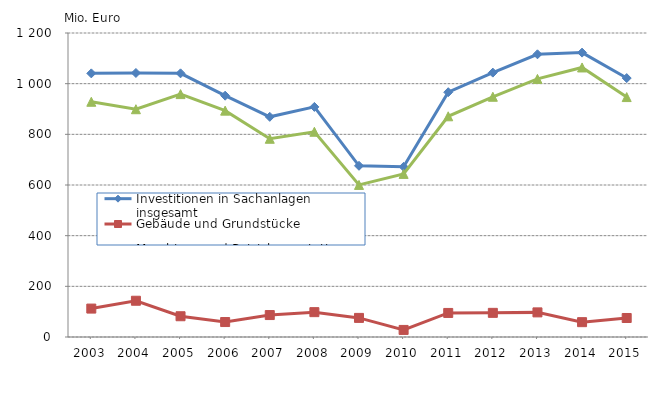
| Category | Investitionen in Sachanlagen insgesamt | Gebäude und Grundstücke | Maschinen und Betriebsausstattung |
|---|---|---|---|
| 2003.0 | 1040.673 | 112.131 | 928.542 |
| 2004.0 | 1042.199 | 143.092 | 899.107 |
| 2005.0 | 1040.771 | 81.943 | 958.828 |
| 2006.0 | 952.585 | 59.05 | 893.535 |
| 2007.0 | 869.086 | 86.618 | 782.467 |
| 2008.0 | 908.294 | 98.112 | 810.182 |
| 2009.0 | 675.811 | 75.418 | 600.393 |
| 2010.0 | 671.734 | 27.895 | 643.839 |
| 2011.0 | 966.215 | 94.98 | 871.235 |
| 2012.0 | 1043.637 | 95.334 | 948.303 |
| 2013.0 | 1115.956 | 97.198 | 1018.758 |
| 2014.0 | 1122.553 | 58.555 | 1063.999 |
| 2015.0 | 1022.095 | 75.015 | 947.081 |